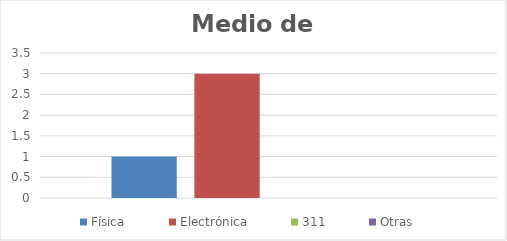
| Category | Física | Electrónica | 311 | Otras |
|---|---|---|---|---|
| 0 | 1 | 3 | 0 | 0 |